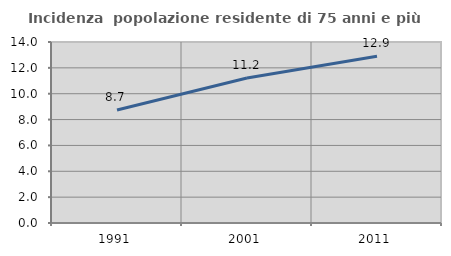
| Category | Incidenza  popolazione residente di 75 anni e più |
|---|---|
| 1991.0 | 8.743 |
| 2001.0 | 11.218 |
| 2011.0 | 12.894 |